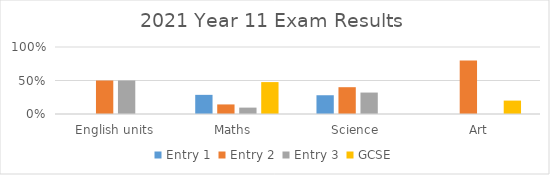
| Category | Entry 1 | Entry 2 | Entry 3 | GCSE |
|---|---|---|---|---|
| English units | 0 | 0.5 | 0.5 | 0 |
| Maths  | 0.286 | 0.143 | 0.095 | 0.476 |
| Science  | 0.28 | 0.4 | 0.32 | 0 |
| Art | 0 | 0.8 | 0 | 0.2 |